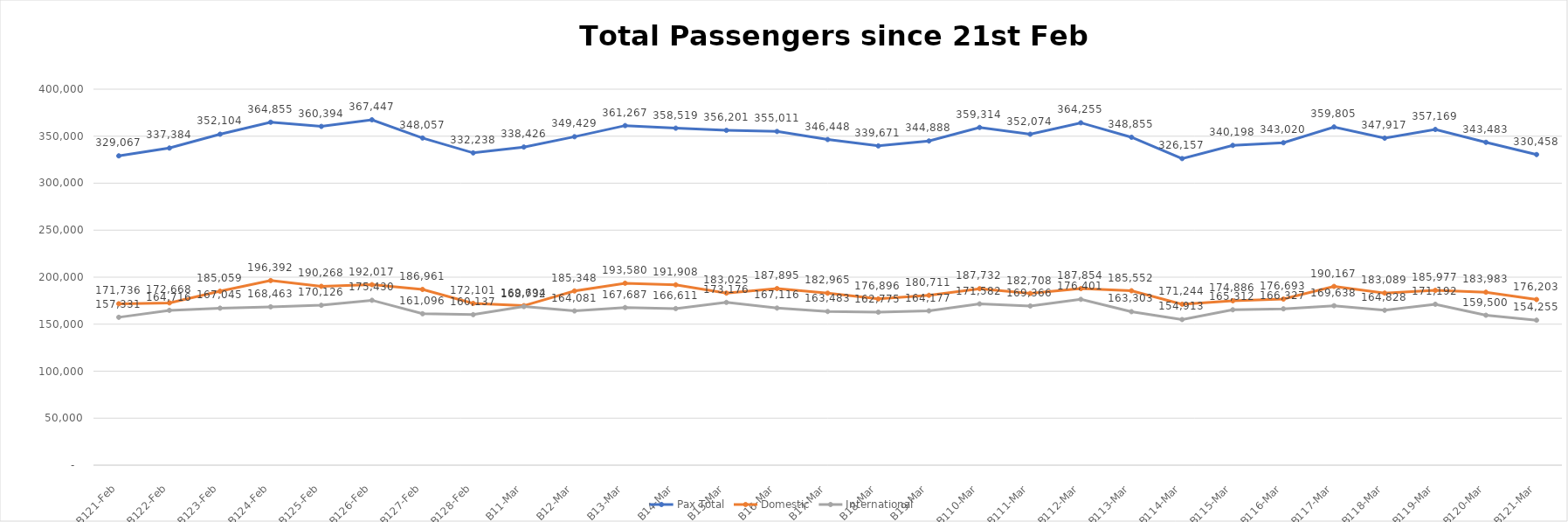
| Category | Pax Total |  Domestic  |  International  |
|---|---|---|---|
| 2023-02-21 | 329067 | 171736 | 157331 |
| 2023-02-22 | 337384 | 172668 | 164716 |
| 2023-02-23 | 352104 | 185059 | 167045 |
| 2023-02-24 | 364855 | 196392 | 168463 |
| 2023-02-25 | 360394 | 190268 | 170126 |
| 2023-02-26 | 367447 | 192017 | 175430 |
| 2023-02-27 | 348057 | 186961 | 161096 |
| 2023-02-28 | 332238 | 172101 | 160137 |
| 2023-03-01 | 338426 | 169694 | 168732 |
| 2023-03-02 | 349429 | 185348 | 164081 |
| 2023-03-03 | 361267 | 193580 | 167687 |
| 2023-03-04 | 358519 | 191908 | 166611 |
| 2023-03-05 | 356201 | 183025 | 173176 |
| 2023-03-06 | 355011 | 187895 | 167116 |
| 2023-03-07 | 346448 | 182965 | 163483 |
| 2023-03-08 | 339671 | 176896 | 162775 |
| 2023-03-09 | 344888 | 180711 | 164177 |
| 2023-03-10 | 359314 | 187732 | 171582 |
| 2023-03-11 | 352074 | 182708 | 169366 |
| 2023-03-12 | 364255 | 187854 | 176401 |
| 2023-03-13 | 348855 | 185552 | 163303 |
| 2023-03-14 | 326157 | 171244 | 154913 |
| 2023-03-15 | 340198 | 174886 | 165312 |
| 2023-03-16 | 343020 | 176693 | 166327 |
| 2023-03-17 | 359805 | 190167 | 169638 |
| 2023-03-18 | 347917 | 183089 | 164828 |
| 2023-03-19 | 357169 | 185977 | 171192 |
| 2023-03-20 | 343483 | 183983 | 159500 |
| 2023-03-21 | 330458 | 176203 | 154255 |